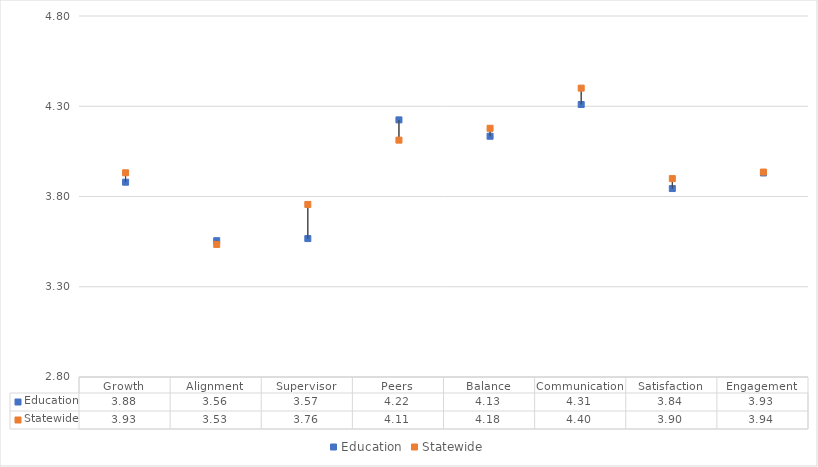
| Category | Education | Statewide |
|---|---|---|
| Growth | 3.879 | 3.931 |
| Alignment | 3.555 | 3.534 |
| Supervisor | 3.567 | 3.756 |
| Peers | 4.224 | 4.112 |
| Balance | 4.134 | 4.178 |
| Communication | 4.31 | 4.4 |
| Satisfaction | 3.844 | 3.899 |
| Engagement | 3.93 | 3.936 |